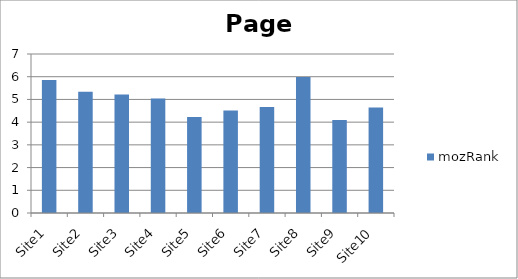
| Category | mozRank |
|---|---|
| Site1 | 5.86 |
| Site2 | 5.34 |
| Site3 | 5.22 |
| Site4 | 5.04 |
| Site5 | 4.23 |
| Site6 | 4.51 |
| Site7 | 4.67 |
| Site8 | 5.99 |
| Site9 | 4.09 |
| Site10 | 4.64 |